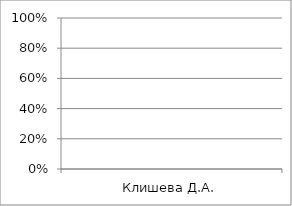
| Category | Series 0 | 2 |
|---|---|---|
| Клишева Д.А. | 0 | 0 |